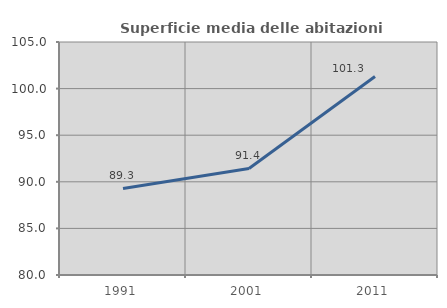
| Category | Superficie media delle abitazioni occupate |
|---|---|
| 1991.0 | 89.29 |
| 2001.0 | 91.435 |
| 2011.0 | 101.303 |